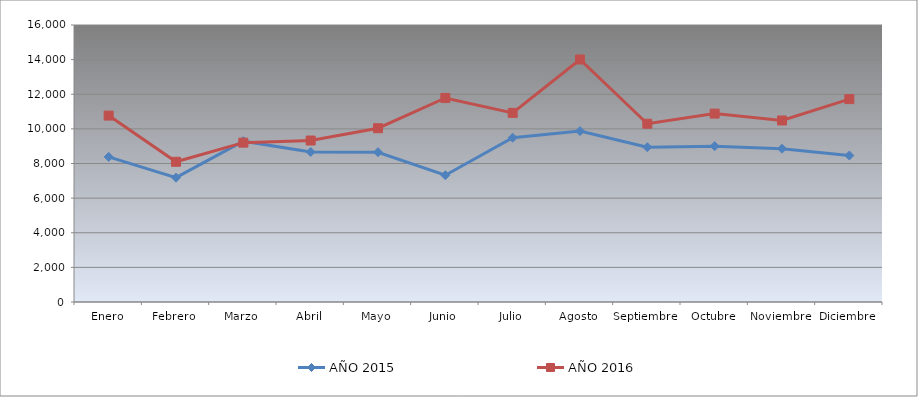
| Category | AÑO 2015 | AÑO 2016 |
|---|---|---|
| Enero | 8383.78 | 10767.016 |
| Febrero | 7181.533 | 8098.754 |
| Marzo | 9290.93 | 9204.82 |
| Abril | 8666.266 | 9327.173 |
| Mayo | 8651.973 | 10038.774 |
| Junio | 7322.776 | 11785.968 |
| Julio | 9490.183 | 10925.585 |
| Agosto | 9871.035 | 14008.867 |
| Septiembre | 8941.185 | 10298.162 |
| Octubre | 9002.558 | 10881.538 |
| Noviembre | 8852.067 | 10485.116 |
| Diciembre | 8461.127 | 11719.408 |